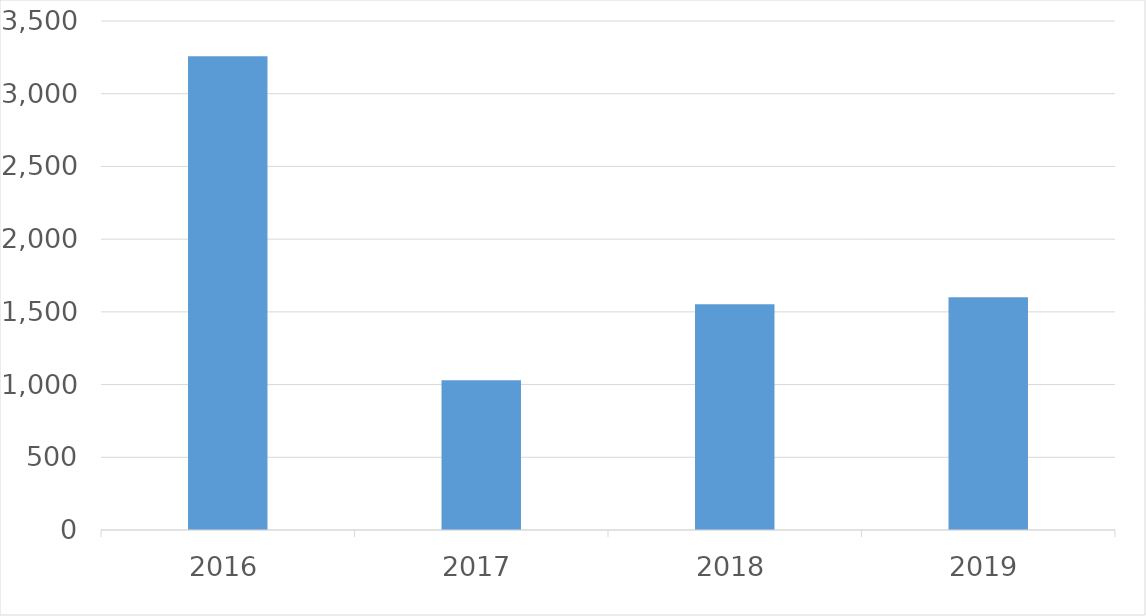
| Category | Series 0 |
|---|---|
| 2016 | 3257 |
| 2017 | 1029 |
| 2018 | 1552 |
| 2019 | 1600 |